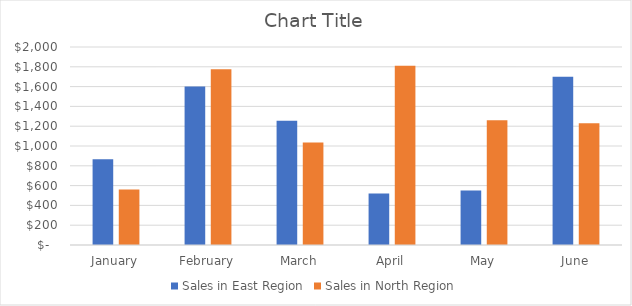
| Category | Sales in East Region | Sales in North Region |
|---|---|---|
| January | 865 | 560 |
| February | 1600 | 1775 |
| March | 1255 | 1035 |
| April | 520 | 1810 |
| May | 550 | 1260 |
| June | 1700 | 1230 |